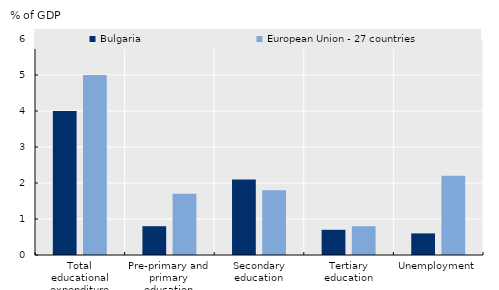
| Category | Bulgaria | European Union - 27 countries |
|---|---|---|
| Total educational expenditure | 4 | 5 |
| Pre-primary and primary education | 0.8 | 1.7 |
| Secondary education | 2.1 | 1.8 |
| Tertiary education | 0.7 | 0.8 |
| Unemployment | 0.6 | 2.2 |